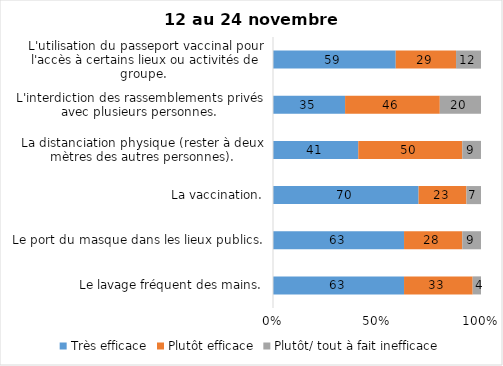
| Category | Très efficace | Plutôt efficace | Plutôt/ tout à fait inefficace |
|---|---|---|---|
| Le lavage fréquent des mains. | 63 | 33 | 4 |
| Le port du masque dans les lieux publics. | 63 | 28 | 9 |
| La vaccination. | 70 | 23 | 7 |
| La distanciation physique (rester à deux mètres des autres personnes). | 41 | 50 | 9 |
| L'interdiction des rassemblements privés avec plusieurs personnes. | 35 | 46 | 20 |
| L'utilisation du passeport vaccinal pour l'accès à certains lieux ou activités de groupe.  | 59 | 29 | 12 |